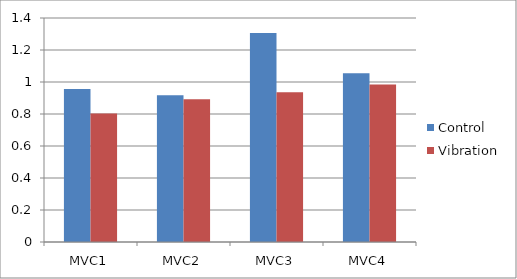
| Category | Control | Vibration |
|---|---|---|
| MVC1 | 0.956 | 0.803 |
| MVC2 | 0.917 | 0.893 |
| MVC3 | 1.307 | 0.935 |
| MVC4 | 1.054 | 0.984 |